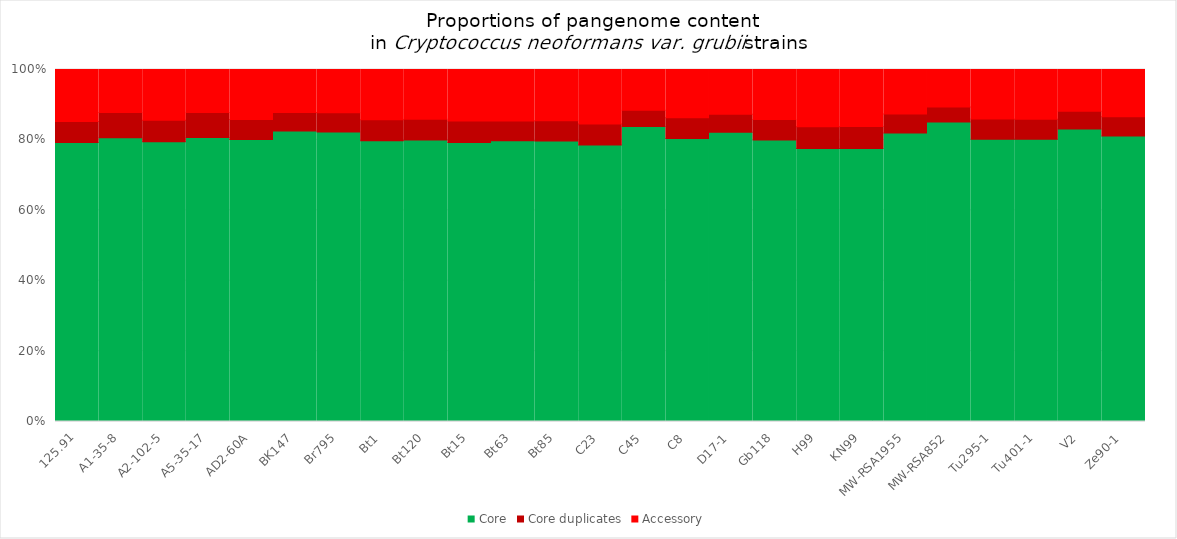
| Category | Core | Core duplicates | Accessory |
|---|---|---|---|
| 125.91 | 5486 | 413 | 1020 |
| A1-35-8 | 5486 | 489 | 830 |
| A2-102-5 | 5486 | 419 | 996 |
| A5-35-17 | 5486 | 481 | 832 |
| AD2-60A | 5486 | 392 | 971 |
| BK147 | 5486 | 349 | 810 |
| Br795 | 5486 | 363 | 820 |
| Bt1 | 5486 | 410 | 981 |
| Bt120 | 5486 | 403 | 972 |
| Bt15 | 5486 | 421 | 1015 |
| Bt63 | 5486 | 388 | 1005 |
| Bt85 | 5486 | 396 | 1002 |
| C23 | 5486 | 418 | 1081 |
| C45 | 5486 | 302 | 756 |
| C8 | 5486 | 400 | 937 |
| D17-1 | 5486 | 344 | 848 |
| Gb118 | 5486 | 398 | 975 |
| H99 | 5486 | 441 | 1149 |
| KN99 | 5486 | 440 | 1147 |
| MW-RSA1955 | 5486 | 364 | 846 |
| MW-RSA852 | 5486 | 278 | 686 |
| Tu295-1 | 5486 | 396 | 960 |
| Tu401-1 | 5486 | 386 | 967 |
| V2 | 5486 | 335 | 781 |
| Ze90-1 | 5486 | 368 | 910 |